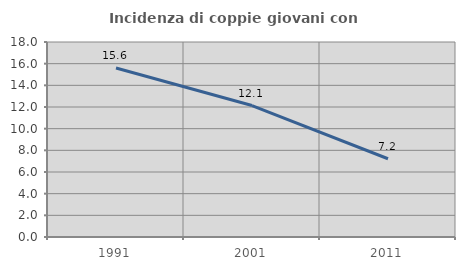
| Category | Incidenza di coppie giovani con figli |
|---|---|
| 1991.0 | 15.595 |
| 2001.0 | 12.133 |
| 2011.0 | 7.224 |